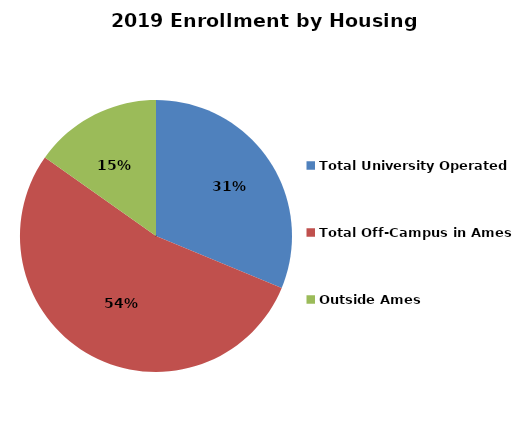
| Category | Series 0 |
|---|---|
| Total University Operated | 0.312 |
| Total Off-Campus in Ames | 0.535 |
| Outside Ames | 0.152 |